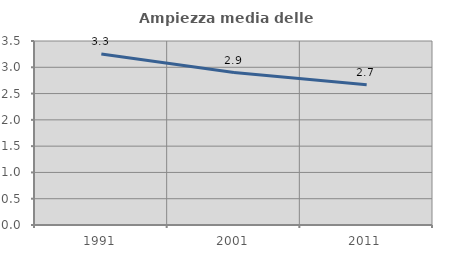
| Category | Ampiezza media delle famiglie |
|---|---|
| 1991.0 | 3.255 |
| 2001.0 | 2.9 |
| 2011.0 | 2.669 |